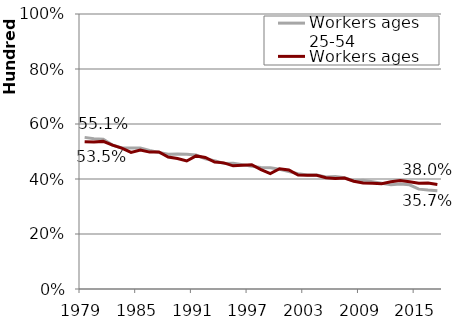
| Category | Workers ages 25-54 | Workers ages 55-64 |
|---|---|---|
| 1979.0 | 55.14 | 53.54 |
| 1980.0 | 54.67 | 53.42 |
| 1981.0 | 54.5 | 53.68 |
| 1982.0 | 52.35 | 52.3 |
| 1983.0 | 51.3 | 51.21 |
| 1984.0 | 51.3 | 49.68 |
| 1985.0 | 51.26 | 50.5 |
| 1986.0 | 50.37 | 49.78 |
| 1987.0 | 49.62 | 49.8 |
| 1988.0 | 49.01 | 47.99 |
| 1989.0 | 49.1 | 47.44 |
| 1990.0 | 48.96 | 46.55 |
| 1991.0 | 48.77 | 48.39 |
| 1992.0 | 47.32 | 47.82 |
| 1993.0 | 46.66 | 46.18 |
| 1994.0 | 45.67 | 45.87 |
| 1995.0 | 45.75 | 44.78 |
| 1996.0 | 45.22 | 44.96 |
| 1997.0 | 44.6 | 45.21 |
| 1998.0 | 44.22 | 43.41 |
| 1999.0 | 44.11 | 41.95 |
| 2000.0 | 43.52 | 43.74 |
| 2001.0 | 42.69 | 43.27 |
| 2002.0 | 41.93 | 41.43 |
| 2003.0 | 41.43 | 41.36 |
| 2004.0 | 41.49 | 41.35 |
| 2005.0 | 40.77 | 40.43 |
| 2006.0 | 40.93 | 40.17 |
| 2007.0 | 40.44 | 40.32 |
| 2008.0 | 39.29 | 39.18 |
| 2009.0 | 39.51 | 38.54 |
| 2010.0 | 38.99 | 38.46 |
| 2011.0 | 38.46 | 38.28 |
| 2012.0 | 37.87 | 38.97 |
| 2013.0 | 38.15 | 39.45 |
| 2014.0 | 37.9 | 38.97 |
| 2015.0 | 36.32 | 38.46 |
| 2016.0 | 35.98 | 38.52 |
| 2017.0 | 35.73 | 38.01 |